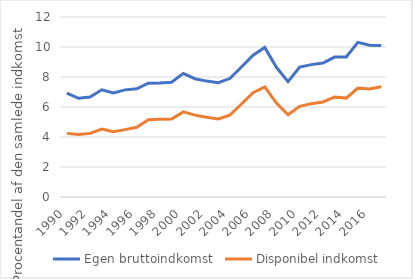
| Category | Egen bruttoindkomst  | Disponibel indkomst |
|---|---|---|
| 1990 | 6.93 | 4.241 |
| 1991 | 6.583 | 4.162 |
| 1992 | 6.664 | 4.242 |
| 1993 | 7.143 | 4.527 |
| 1994 | 6.937 | 4.345 |
| 1995 | 7.143 | 4.491 |
| 1996 | 7.214 | 4.652 |
| 1997 | 7.589 | 5.155 |
| 1998 | 7.599 | 5.176 |
| 1999 | 7.648 | 5.194 |
| 2000 | 8.238 | 5.674 |
| 2001 | 7.887 | 5.459 |
| 2002 | 7.727 | 5.317 |
| 2003 | 7.617 | 5.204 |
| 2004 | 7.897 | 5.46 |
| 2005 | 8.666 | 6.202 |
| 2006 | 9.451 | 6.955 |
| 2007 | 9.968 | 7.345 |
| 2008 | 8.648 | 6.265 |
| 2009 | 7.689 | 5.483 |
| 2010 | 8.66 | 6.041 |
| 2011 | 8.825 | 6.223 |
| 2012 | 8.926 | 6.336 |
| 2013 | 9.326 | 6.672 |
| 2014 | 9.338 | 6.593 |
| 2015 | 10.311 | 7.258 |
| 2016 | 10.121 | 7.205 |
| 2017 | 10.101 | 7.345 |